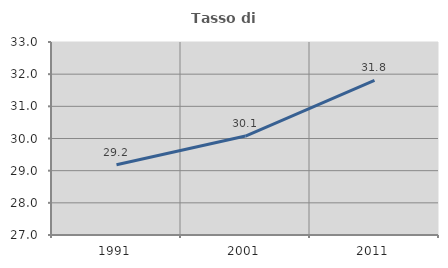
| Category | Tasso di occupazione   |
|---|---|
| 1991.0 | 29.184 |
| 2001.0 | 30.077 |
| 2011.0 | 31.806 |